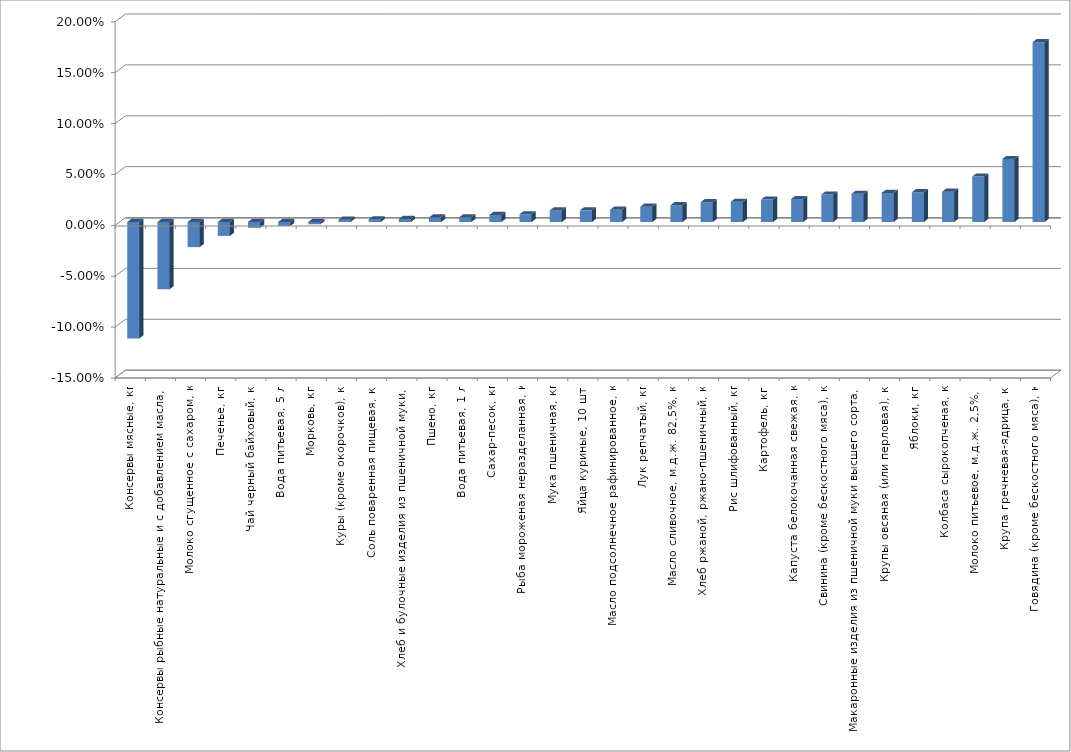
| Category | Series 0 |
|---|---|
| Консервы мясные, кг | -0.114 |
| Консервы рыбные натуральные и с добавлением масла, кг | -0.066 |
| Молоко сгущенное с сахаром, кг | -0.025 |
| Печенье, кг | -0.014 |
| Чай черный байховый, кг | -0.006 |
| Вода питьевая, 5 л | -0.004 |
| Морковь, кг | -0.002 |
| Куры (кроме окорочков), кг | 0.002 |
| Соль поваренная пищевая, кг | 0.003 |
| Хлеб и булочные изделия из пшеничной муки, кг | 0.003 |
| Пшено, кг | 0.004 |
| Вода питьевая, 1 л | 0.005 |
| Сахар-песок, кг | 0.007 |
| Рыба мороженая неразделанная, кг | 0.008 |
| Мука пшеничная, кг | 0.011 |
| Яйца куриные, 10 шт. | 0.011 |
| Масло подсолнечное рафинированное, кг | 0.012 |
| Лук репчатый, кг | 0.015 |
| Масло сливочное, м.д.ж. 82,5%, кг | 0.016 |
| Хлеб ржаной, ржано-пшеничный, кг | 0.019 |
| Рис шлифованный, кг | 0.02 |
| Картофель, кг | 0.022 |
| Капуста белокочанная свежая, кг | 0.023 |
| Свинина (кроме бескостного мяса), кг | 0.027 |
| Макаронные изделия из пшеничной муки высшего сорта, кг | 0.028 |
| Крупы овсяная (или перловая), кг | 0.029 |
| Яблоки, кг | 0.029 |
| Колбаса сырокопченая, кг | 0.03 |
| Молоко питьевое, м.д.ж. 2,5%, л | 0.045 |
| Крупа гречневая-ядрица, кг | 0.062 |
| Говядина (кроме бескостного мяса), кг | 0.177 |